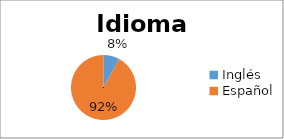
| Category | Idioma |
|---|---|
| Inglés  | 2 |
| Español | 23 |